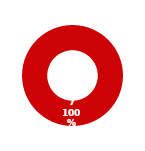
| Category | THIRD-PARTIES |
|---|---|
| MIL 3 Complete | 0 |
| MIL 3 Not Complete | 7 |